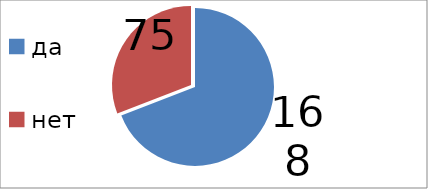
| Category | Series 0 |
|---|---|
| да | 168 |
| нет | 75 |